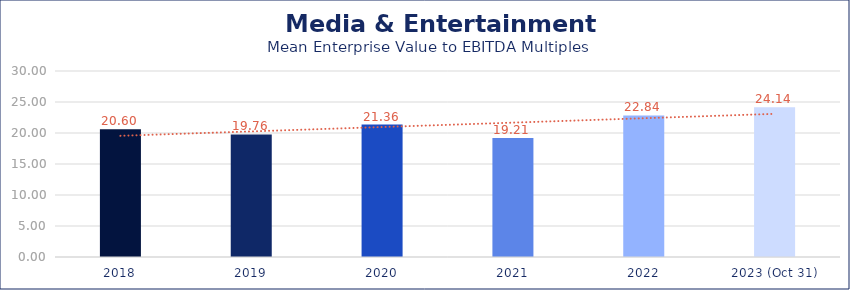
| Category | Media & Entertainment |
|---|---|
| 2018 | 20.6 |
| 2019 | 19.76 |
| 2020 | 21.36 |
| 2021 | 19.21 |
| 2022 | 22.84 |
| 2023 (Oct 31) | 24.14 |